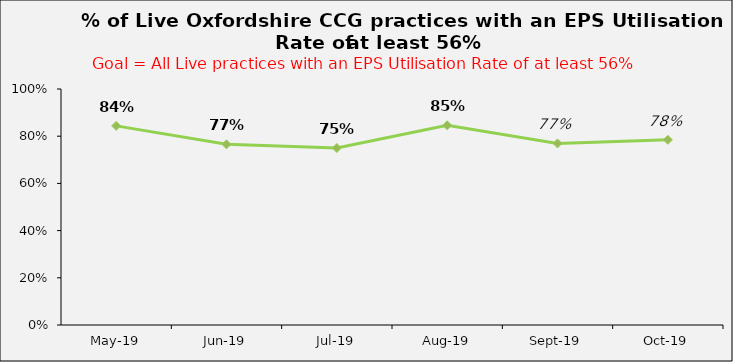
| Category | Bucks CCGs |
|---|---|
| 2019-05-01 | 0.844 |
| 2019-06-01 | 0.766 |
| 2019-07-01 | 0.75 |
| 2019-08-01 | 0.846 |
| 2019-09-01 | 0.769 |
| 2019-10-01 | 0.785 |